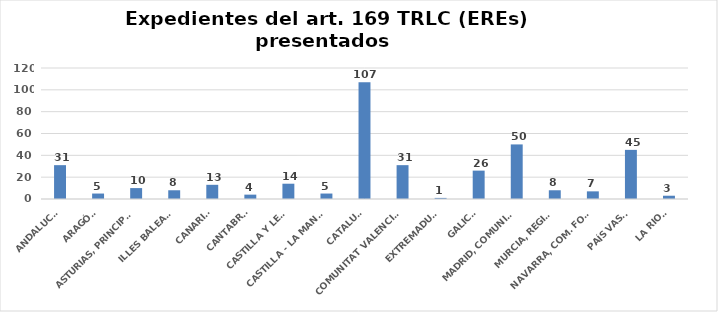
| Category | Series 0 |
|---|---|
| ANDALUCÍA | 31 |
| ARAGÓN | 5 |
| ASTURIAS, PRINCIPADO | 10 |
| ILLES BALEARS | 8 |
| CANARIAS | 13 |
| CANTABRIA | 4 |
| CASTILLA Y LEÓN | 14 |
| CASTILLA - LA MANCHA | 5 |
| CATALUÑA | 107 |
| COMUNITAT VALENCIANA | 31 |
| EXTREMADURA | 1 |
| GALICIA | 26 |
| MADRID, COMUNIDAD | 50 |
| MURCIA, REGIÓN | 8 |
| NAVARRA, COM. FORAL | 7 |
| PAÍS VASCO | 45 |
| LA RIOJA | 3 |